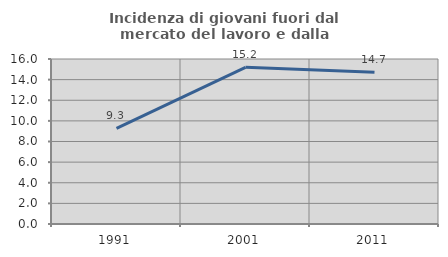
| Category | Incidenza di giovani fuori dal mercato del lavoro e dalla formazione  |
|---|---|
| 1991.0 | 9.278 |
| 2001.0 | 15.19 |
| 2011.0 | 14.706 |